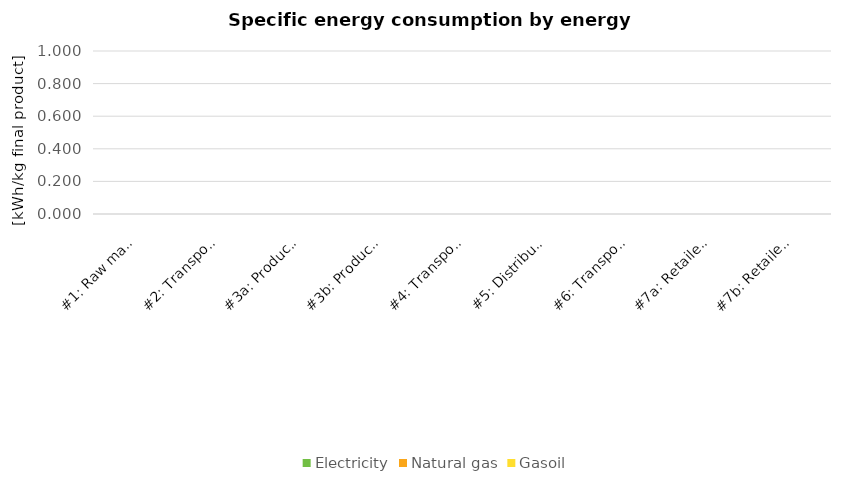
| Category | Electricity | Natural gas | Gasoil |
|---|---|---|---|
| #1: Raw material supplier | 0 | 0 | 0 |
| #2: Transport (supplier - producer) | 0 | 0 | 0 |
| #3a: Producer - raw material | 0 | 0 | 0 |
| #3b: Producer - final product | 0 | 0 | 0 |
| #4: Transport (producer - distribution center) | 0 | 0 | 0 |
| #5: Distribution center | 0 | 0 | 0 |
| #6: Transport (distribution center - retailer) | 0 | 0 | 0 |
| #7a: Retailer - Backroom | 0 | 0 | 0 |
| #7b: Retailer - Display Area | 0 | 0 | 0 |